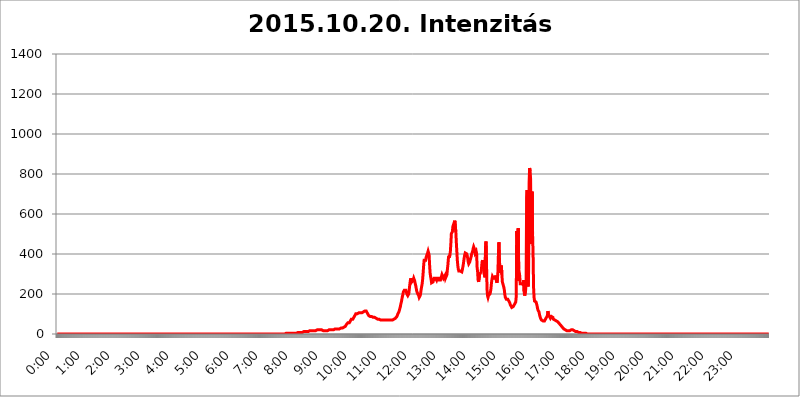
| Category | 2015.10.20. Intenzitás [W/m^2] |
|---|---|
| 0.0 | 0 |
| 0.0006944444444444445 | 0 |
| 0.001388888888888889 | 0 |
| 0.0020833333333333333 | 0 |
| 0.002777777777777778 | 0 |
| 0.003472222222222222 | 0 |
| 0.004166666666666667 | 0 |
| 0.004861111111111111 | 0 |
| 0.005555555555555556 | 0 |
| 0.0062499999999999995 | 0 |
| 0.006944444444444444 | 0 |
| 0.007638888888888889 | 0 |
| 0.008333333333333333 | 0 |
| 0.009027777777777779 | 0 |
| 0.009722222222222222 | 0 |
| 0.010416666666666666 | 0 |
| 0.011111111111111112 | 0 |
| 0.011805555555555555 | 0 |
| 0.012499999999999999 | 0 |
| 0.013194444444444444 | 0 |
| 0.013888888888888888 | 0 |
| 0.014583333333333332 | 0 |
| 0.015277777777777777 | 0 |
| 0.015972222222222224 | 0 |
| 0.016666666666666666 | 0 |
| 0.017361111111111112 | 0 |
| 0.018055555555555557 | 0 |
| 0.01875 | 0 |
| 0.019444444444444445 | 0 |
| 0.02013888888888889 | 0 |
| 0.020833333333333332 | 0 |
| 0.02152777777777778 | 0 |
| 0.022222222222222223 | 0 |
| 0.02291666666666667 | 0 |
| 0.02361111111111111 | 0 |
| 0.024305555555555556 | 0 |
| 0.024999999999999998 | 0 |
| 0.025694444444444447 | 0 |
| 0.02638888888888889 | 0 |
| 0.027083333333333334 | 0 |
| 0.027777777777777776 | 0 |
| 0.02847222222222222 | 0 |
| 0.029166666666666664 | 0 |
| 0.029861111111111113 | 0 |
| 0.030555555555555555 | 0 |
| 0.03125 | 0 |
| 0.03194444444444445 | 0 |
| 0.03263888888888889 | 0 |
| 0.03333333333333333 | 0 |
| 0.034027777777777775 | 0 |
| 0.034722222222222224 | 0 |
| 0.035416666666666666 | 0 |
| 0.036111111111111115 | 0 |
| 0.03680555555555556 | 0 |
| 0.0375 | 0 |
| 0.03819444444444444 | 0 |
| 0.03888888888888889 | 0 |
| 0.03958333333333333 | 0 |
| 0.04027777777777778 | 0 |
| 0.04097222222222222 | 0 |
| 0.041666666666666664 | 0 |
| 0.042361111111111106 | 0 |
| 0.04305555555555556 | 0 |
| 0.043750000000000004 | 0 |
| 0.044444444444444446 | 0 |
| 0.04513888888888889 | 0 |
| 0.04583333333333334 | 0 |
| 0.04652777777777778 | 0 |
| 0.04722222222222222 | 0 |
| 0.04791666666666666 | 0 |
| 0.04861111111111111 | 0 |
| 0.049305555555555554 | 0 |
| 0.049999999999999996 | 0 |
| 0.05069444444444445 | 0 |
| 0.051388888888888894 | 0 |
| 0.052083333333333336 | 0 |
| 0.05277777777777778 | 0 |
| 0.05347222222222222 | 0 |
| 0.05416666666666667 | 0 |
| 0.05486111111111111 | 0 |
| 0.05555555555555555 | 0 |
| 0.05625 | 0 |
| 0.05694444444444444 | 0 |
| 0.057638888888888885 | 0 |
| 0.05833333333333333 | 0 |
| 0.05902777777777778 | 0 |
| 0.059722222222222225 | 0 |
| 0.06041666666666667 | 0 |
| 0.061111111111111116 | 0 |
| 0.06180555555555556 | 0 |
| 0.0625 | 0 |
| 0.06319444444444444 | 0 |
| 0.06388888888888888 | 0 |
| 0.06458333333333334 | 0 |
| 0.06527777777777778 | 0 |
| 0.06597222222222222 | 0 |
| 0.06666666666666667 | 0 |
| 0.06736111111111111 | 0 |
| 0.06805555555555555 | 0 |
| 0.06874999999999999 | 0 |
| 0.06944444444444443 | 0 |
| 0.07013888888888889 | 0 |
| 0.07083333333333333 | 0 |
| 0.07152777777777779 | 0 |
| 0.07222222222222223 | 0 |
| 0.07291666666666667 | 0 |
| 0.07361111111111111 | 0 |
| 0.07430555555555556 | 0 |
| 0.075 | 0 |
| 0.07569444444444444 | 0 |
| 0.0763888888888889 | 0 |
| 0.07708333333333334 | 0 |
| 0.07777777777777778 | 0 |
| 0.07847222222222222 | 0 |
| 0.07916666666666666 | 0 |
| 0.0798611111111111 | 0 |
| 0.08055555555555556 | 0 |
| 0.08125 | 0 |
| 0.08194444444444444 | 0 |
| 0.08263888888888889 | 0 |
| 0.08333333333333333 | 0 |
| 0.08402777777777777 | 0 |
| 0.08472222222222221 | 0 |
| 0.08541666666666665 | 0 |
| 0.08611111111111112 | 0 |
| 0.08680555555555557 | 0 |
| 0.08750000000000001 | 0 |
| 0.08819444444444445 | 0 |
| 0.08888888888888889 | 0 |
| 0.08958333333333333 | 0 |
| 0.09027777777777778 | 0 |
| 0.09097222222222222 | 0 |
| 0.09166666666666667 | 0 |
| 0.09236111111111112 | 0 |
| 0.09305555555555556 | 0 |
| 0.09375 | 0 |
| 0.09444444444444444 | 0 |
| 0.09513888888888888 | 0 |
| 0.09583333333333333 | 0 |
| 0.09652777777777777 | 0 |
| 0.09722222222222222 | 0 |
| 0.09791666666666667 | 0 |
| 0.09861111111111111 | 0 |
| 0.09930555555555555 | 0 |
| 0.09999999999999999 | 0 |
| 0.10069444444444443 | 0 |
| 0.1013888888888889 | 0 |
| 0.10208333333333335 | 0 |
| 0.10277777777777779 | 0 |
| 0.10347222222222223 | 0 |
| 0.10416666666666667 | 0 |
| 0.10486111111111111 | 0 |
| 0.10555555555555556 | 0 |
| 0.10625 | 0 |
| 0.10694444444444444 | 0 |
| 0.1076388888888889 | 0 |
| 0.10833333333333334 | 0 |
| 0.10902777777777778 | 0 |
| 0.10972222222222222 | 0 |
| 0.1111111111111111 | 0 |
| 0.11180555555555556 | 0 |
| 0.11180555555555556 | 0 |
| 0.1125 | 0 |
| 0.11319444444444444 | 0 |
| 0.11388888888888889 | 0 |
| 0.11458333333333333 | 0 |
| 0.11527777777777777 | 0 |
| 0.11597222222222221 | 0 |
| 0.11666666666666665 | 0 |
| 0.1173611111111111 | 0 |
| 0.11805555555555557 | 0 |
| 0.11944444444444445 | 0 |
| 0.12013888888888889 | 0 |
| 0.12083333333333333 | 0 |
| 0.12152777777777778 | 0 |
| 0.12222222222222223 | 0 |
| 0.12291666666666667 | 0 |
| 0.12291666666666667 | 0 |
| 0.12361111111111112 | 0 |
| 0.12430555555555556 | 0 |
| 0.125 | 0 |
| 0.12569444444444444 | 0 |
| 0.12638888888888888 | 0 |
| 0.12708333333333333 | 0 |
| 0.16875 | 0 |
| 0.12847222222222224 | 0 |
| 0.12916666666666668 | 0 |
| 0.12986111111111112 | 0 |
| 0.13055555555555556 | 0 |
| 0.13125 | 0 |
| 0.13194444444444445 | 0 |
| 0.1326388888888889 | 0 |
| 0.13333333333333333 | 0 |
| 0.13402777777777777 | 0 |
| 0.13402777777777777 | 0 |
| 0.13472222222222222 | 0 |
| 0.13541666666666666 | 0 |
| 0.1361111111111111 | 0 |
| 0.13749999999999998 | 0 |
| 0.13819444444444443 | 0 |
| 0.1388888888888889 | 0 |
| 0.13958333333333334 | 0 |
| 0.14027777777777778 | 0 |
| 0.14097222222222222 | 0 |
| 0.14166666666666666 | 0 |
| 0.1423611111111111 | 0 |
| 0.14305555555555557 | 0 |
| 0.14375000000000002 | 0 |
| 0.14444444444444446 | 0 |
| 0.1451388888888889 | 0 |
| 0.1451388888888889 | 0 |
| 0.14652777777777778 | 0 |
| 0.14722222222222223 | 0 |
| 0.14791666666666667 | 0 |
| 0.1486111111111111 | 0 |
| 0.14930555555555555 | 0 |
| 0.15 | 0 |
| 0.15069444444444444 | 0 |
| 0.15138888888888888 | 0 |
| 0.15208333333333332 | 0 |
| 0.15277777777777776 | 0 |
| 0.15347222222222223 | 0 |
| 0.15416666666666667 | 0 |
| 0.15486111111111112 | 0 |
| 0.15555555555555556 | 0 |
| 0.15625 | 0 |
| 0.15694444444444444 | 0 |
| 0.15763888888888888 | 0 |
| 0.15833333333333333 | 0 |
| 0.15902777777777777 | 0 |
| 0.15972222222222224 | 0 |
| 0.16041666666666668 | 0 |
| 0.16111111111111112 | 0 |
| 0.16180555555555556 | 0 |
| 0.1625 | 0 |
| 0.16319444444444445 | 0 |
| 0.1638888888888889 | 0 |
| 0.16458333333333333 | 0 |
| 0.16527777777777777 | 0 |
| 0.16597222222222222 | 0 |
| 0.16666666666666666 | 0 |
| 0.1673611111111111 | 0 |
| 0.16805555555555554 | 0 |
| 0.16874999999999998 | 0 |
| 0.16944444444444443 | 0 |
| 0.17013888888888887 | 0 |
| 0.1708333333333333 | 0 |
| 0.17152777777777775 | 0 |
| 0.17222222222222225 | 0 |
| 0.1729166666666667 | 0 |
| 0.17361111111111113 | 0 |
| 0.17430555555555557 | 0 |
| 0.17500000000000002 | 0 |
| 0.17569444444444446 | 0 |
| 0.1763888888888889 | 0 |
| 0.17708333333333334 | 0 |
| 0.17777777777777778 | 0 |
| 0.17847222222222223 | 0 |
| 0.17916666666666667 | 0 |
| 0.1798611111111111 | 0 |
| 0.18055555555555555 | 0 |
| 0.18125 | 0 |
| 0.18194444444444444 | 0 |
| 0.1826388888888889 | 0 |
| 0.18333333333333335 | 0 |
| 0.1840277777777778 | 0 |
| 0.18472222222222223 | 0 |
| 0.18541666666666667 | 0 |
| 0.18611111111111112 | 0 |
| 0.18680555555555556 | 0 |
| 0.1875 | 0 |
| 0.18819444444444444 | 0 |
| 0.18888888888888888 | 0 |
| 0.18958333333333333 | 0 |
| 0.19027777777777777 | 0 |
| 0.1909722222222222 | 0 |
| 0.19166666666666665 | 0 |
| 0.19236111111111112 | 0 |
| 0.19305555555555554 | 0 |
| 0.19375 | 0 |
| 0.19444444444444445 | 0 |
| 0.1951388888888889 | 0 |
| 0.19583333333333333 | 0 |
| 0.19652777777777777 | 0 |
| 0.19722222222222222 | 0 |
| 0.19791666666666666 | 0 |
| 0.1986111111111111 | 0 |
| 0.19930555555555554 | 0 |
| 0.19999999999999998 | 0 |
| 0.20069444444444443 | 0 |
| 0.20138888888888887 | 0 |
| 0.2020833333333333 | 0 |
| 0.2027777777777778 | 0 |
| 0.2034722222222222 | 0 |
| 0.2041666666666667 | 0 |
| 0.20486111111111113 | 0 |
| 0.20555555555555557 | 0 |
| 0.20625000000000002 | 0 |
| 0.20694444444444446 | 0 |
| 0.2076388888888889 | 0 |
| 0.20833333333333334 | 0 |
| 0.20902777777777778 | 0 |
| 0.20972222222222223 | 0 |
| 0.21041666666666667 | 0 |
| 0.2111111111111111 | 0 |
| 0.21180555555555555 | 0 |
| 0.2125 | 0 |
| 0.21319444444444444 | 0 |
| 0.2138888888888889 | 0 |
| 0.21458333333333335 | 0 |
| 0.2152777777777778 | 0 |
| 0.21597222222222223 | 0 |
| 0.21666666666666667 | 0 |
| 0.21736111111111112 | 0 |
| 0.21805555555555556 | 0 |
| 0.21875 | 0 |
| 0.21944444444444444 | 0 |
| 0.22013888888888888 | 0 |
| 0.22083333333333333 | 0 |
| 0.22152777777777777 | 0 |
| 0.2222222222222222 | 0 |
| 0.22291666666666665 | 0 |
| 0.2236111111111111 | 0 |
| 0.22430555555555556 | 0 |
| 0.225 | 0 |
| 0.22569444444444445 | 0 |
| 0.2263888888888889 | 0 |
| 0.22708333333333333 | 0 |
| 0.22777777777777777 | 0 |
| 0.22847222222222222 | 0 |
| 0.22916666666666666 | 0 |
| 0.2298611111111111 | 0 |
| 0.23055555555555554 | 0 |
| 0.23124999999999998 | 0 |
| 0.23194444444444443 | 0 |
| 0.23263888888888887 | 0 |
| 0.2333333333333333 | 0 |
| 0.2340277777777778 | 0 |
| 0.2347222222222222 | 0 |
| 0.2354166666666667 | 0 |
| 0.23611111111111113 | 0 |
| 0.23680555555555557 | 0 |
| 0.23750000000000002 | 0 |
| 0.23819444444444446 | 0 |
| 0.2388888888888889 | 0 |
| 0.23958333333333334 | 0 |
| 0.24027777777777778 | 0 |
| 0.24097222222222223 | 0 |
| 0.24166666666666667 | 0 |
| 0.2423611111111111 | 0 |
| 0.24305555555555555 | 0 |
| 0.24375 | 0 |
| 0.24444444444444446 | 0 |
| 0.24513888888888888 | 0 |
| 0.24583333333333335 | 0 |
| 0.2465277777777778 | 0 |
| 0.24722222222222223 | 0 |
| 0.24791666666666667 | 0 |
| 0.24861111111111112 | 0 |
| 0.24930555555555556 | 0 |
| 0.25 | 0 |
| 0.25069444444444444 | 0 |
| 0.2513888888888889 | 0 |
| 0.2520833333333333 | 0 |
| 0.25277777777777777 | 0 |
| 0.2534722222222222 | 0 |
| 0.25416666666666665 | 0 |
| 0.2548611111111111 | 0 |
| 0.2555555555555556 | 0 |
| 0.25625000000000003 | 0 |
| 0.2569444444444445 | 0 |
| 0.2576388888888889 | 0 |
| 0.25833333333333336 | 0 |
| 0.2590277777777778 | 0 |
| 0.25972222222222224 | 0 |
| 0.2604166666666667 | 0 |
| 0.2611111111111111 | 0 |
| 0.26180555555555557 | 0 |
| 0.2625 | 0 |
| 0.26319444444444445 | 0 |
| 0.2638888888888889 | 0 |
| 0.26458333333333334 | 0 |
| 0.2652777777777778 | 0 |
| 0.2659722222222222 | 0 |
| 0.26666666666666666 | 0 |
| 0.2673611111111111 | 0 |
| 0.26805555555555555 | 0 |
| 0.26875 | 0 |
| 0.26944444444444443 | 0 |
| 0.2701388888888889 | 0 |
| 0.2708333333333333 | 0 |
| 0.27152777777777776 | 0 |
| 0.2722222222222222 | 0 |
| 0.27291666666666664 | 0 |
| 0.2736111111111111 | 0 |
| 0.2743055555555555 | 0 |
| 0.27499999999999997 | 0 |
| 0.27569444444444446 | 0 |
| 0.27638888888888885 | 0 |
| 0.27708333333333335 | 0 |
| 0.2777777777777778 | 0 |
| 0.27847222222222223 | 0 |
| 0.2791666666666667 | 0 |
| 0.2798611111111111 | 0 |
| 0.28055555555555556 | 0 |
| 0.28125 | 0 |
| 0.28194444444444444 | 0 |
| 0.2826388888888889 | 0 |
| 0.2833333333333333 | 0 |
| 0.28402777777777777 | 0 |
| 0.2847222222222222 | 0 |
| 0.28541666666666665 | 0 |
| 0.28611111111111115 | 0 |
| 0.28680555555555554 | 0 |
| 0.28750000000000003 | 0 |
| 0.2881944444444445 | 0 |
| 0.2888888888888889 | 0 |
| 0.28958333333333336 | 0 |
| 0.2902777777777778 | 0 |
| 0.29097222222222224 | 0 |
| 0.2916666666666667 | 0 |
| 0.2923611111111111 | 0 |
| 0.29305555555555557 | 0 |
| 0.29375 | 0 |
| 0.29444444444444445 | 0 |
| 0.2951388888888889 | 0 |
| 0.29583333333333334 | 0 |
| 0.2965277777777778 | 0 |
| 0.2972222222222222 | 0 |
| 0.29791666666666666 | 0 |
| 0.2986111111111111 | 0 |
| 0.29930555555555555 | 0 |
| 0.3 | 0 |
| 0.30069444444444443 | 0 |
| 0.3013888888888889 | 0 |
| 0.3020833333333333 | 0 |
| 0.30277777777777776 | 0 |
| 0.3034722222222222 | 0 |
| 0.30416666666666664 | 0 |
| 0.3048611111111111 | 0 |
| 0.3055555555555555 | 0 |
| 0.30624999999999997 | 0 |
| 0.3069444444444444 | 0 |
| 0.3076388888888889 | 0 |
| 0.30833333333333335 | 0 |
| 0.3090277777777778 | 0 |
| 0.30972222222222223 | 0 |
| 0.3104166666666667 | 0 |
| 0.3111111111111111 | 0 |
| 0.31180555555555556 | 0 |
| 0.3125 | 0 |
| 0.31319444444444444 | 0 |
| 0.3138888888888889 | 0 |
| 0.3145833333333333 | 0 |
| 0.31527777777777777 | 0 |
| 0.3159722222222222 | 0 |
| 0.31666666666666665 | 0 |
| 0.31736111111111115 | 0 |
| 0.31805555555555554 | 0 |
| 0.31875000000000003 | 0 |
| 0.3194444444444445 | 0 |
| 0.3201388888888889 | 0 |
| 0.32083333333333336 | 3.525 |
| 0.3215277777777778 | 3.525 |
| 0.32222222222222224 | 3.525 |
| 0.3229166666666667 | 3.525 |
| 0.3236111111111111 | 3.525 |
| 0.32430555555555557 | 3.525 |
| 0.325 | 3.525 |
| 0.32569444444444445 | 3.525 |
| 0.3263888888888889 | 3.525 |
| 0.32708333333333334 | 3.525 |
| 0.3277777777777778 | 3.525 |
| 0.3284722222222222 | 3.525 |
| 0.32916666666666666 | 3.525 |
| 0.3298611111111111 | 3.525 |
| 0.33055555555555555 | 3.525 |
| 0.33125 | 3.525 |
| 0.33194444444444443 | 3.525 |
| 0.3326388888888889 | 3.525 |
| 0.3333333333333333 | 3.525 |
| 0.3340277777777778 | 3.525 |
| 0.3347222222222222 | 7.887 |
| 0.3354166666666667 | 3.525 |
| 0.3361111111111111 | 3.525 |
| 0.3368055555555556 | 3.525 |
| 0.33749999999999997 | 7.887 |
| 0.33819444444444446 | 7.887 |
| 0.33888888888888885 | 7.887 |
| 0.33958333333333335 | 7.887 |
| 0.34027777777777773 | 7.887 |
| 0.34097222222222223 | 7.887 |
| 0.3416666666666666 | 7.887 |
| 0.3423611111111111 | 7.887 |
| 0.3430555555555555 | 7.887 |
| 0.34375 | 7.887 |
| 0.3444444444444445 | 7.887 |
| 0.3451388888888889 | 7.887 |
| 0.3458333333333334 | 12.257 |
| 0.34652777777777777 | 12.257 |
| 0.34722222222222227 | 12.257 |
| 0.34791666666666665 | 12.257 |
| 0.34861111111111115 | 12.257 |
| 0.34930555555555554 | 12.257 |
| 0.35000000000000003 | 12.257 |
| 0.3506944444444444 | 12.257 |
| 0.3513888888888889 | 12.257 |
| 0.3520833333333333 | 12.257 |
| 0.3527777777777778 | 12.257 |
| 0.3534722222222222 | 16.636 |
| 0.3541666666666667 | 16.636 |
| 0.3548611111111111 | 16.636 |
| 0.35555555555555557 | 16.636 |
| 0.35625 | 16.636 |
| 0.35694444444444445 | 16.636 |
| 0.3576388888888889 | 16.636 |
| 0.35833333333333334 | 16.636 |
| 0.3590277777777778 | 16.636 |
| 0.3597222222222222 | 16.636 |
| 0.36041666666666666 | 16.636 |
| 0.3611111111111111 | 16.636 |
| 0.36180555555555555 | 16.636 |
| 0.3625 | 16.636 |
| 0.36319444444444443 | 21.024 |
| 0.3638888888888889 | 21.024 |
| 0.3645833333333333 | 21.024 |
| 0.3652777777777778 | 21.024 |
| 0.3659722222222222 | 21.024 |
| 0.3666666666666667 | 21.024 |
| 0.3673611111111111 | 21.024 |
| 0.3680555555555556 | 21.024 |
| 0.36874999999999997 | 21.024 |
| 0.36944444444444446 | 21.024 |
| 0.37013888888888885 | 21.024 |
| 0.37083333333333335 | 21.024 |
| 0.37152777777777773 | 16.636 |
| 0.37222222222222223 | 16.636 |
| 0.3729166666666666 | 16.636 |
| 0.3736111111111111 | 21.024 |
| 0.3743055555555555 | 21.024 |
| 0.375 | 16.636 |
| 0.3756944444444445 | 16.636 |
| 0.3763888888888889 | 16.636 |
| 0.3770833333333334 | 16.636 |
| 0.37777777777777777 | 16.636 |
| 0.37847222222222227 | 21.024 |
| 0.37916666666666665 | 16.636 |
| 0.37986111111111115 | 16.636 |
| 0.38055555555555554 | 21.024 |
| 0.38125000000000003 | 21.024 |
| 0.3819444444444444 | 21.024 |
| 0.3826388888888889 | 21.024 |
| 0.3833333333333333 | 21.024 |
| 0.3840277777777778 | 21.024 |
| 0.3847222222222222 | 21.024 |
| 0.3854166666666667 | 21.024 |
| 0.3861111111111111 | 21.024 |
| 0.38680555555555557 | 21.024 |
| 0.3875 | 21.024 |
| 0.38819444444444445 | 25.419 |
| 0.3888888888888889 | 25.419 |
| 0.38958333333333334 | 25.419 |
| 0.3902777777777778 | 21.024 |
| 0.3909722222222222 | 21.024 |
| 0.39166666666666666 | 25.419 |
| 0.3923611111111111 | 25.419 |
| 0.39305555555555555 | 25.419 |
| 0.39375 | 25.419 |
| 0.39444444444444443 | 25.419 |
| 0.3951388888888889 | 25.419 |
| 0.3958333333333333 | 25.419 |
| 0.3965277777777778 | 25.419 |
| 0.3972222222222222 | 29.823 |
| 0.3979166666666667 | 29.823 |
| 0.3986111111111111 | 29.823 |
| 0.3993055555555556 | 29.823 |
| 0.39999999999999997 | 29.823 |
| 0.40069444444444446 | 29.823 |
| 0.40138888888888885 | 34.234 |
| 0.40208333333333335 | 34.234 |
| 0.40277777777777773 | 34.234 |
| 0.40347222222222223 | 38.653 |
| 0.4041666666666666 | 38.653 |
| 0.4048611111111111 | 43.079 |
| 0.4055555555555555 | 47.511 |
| 0.40625 | 47.511 |
| 0.4069444444444445 | 51.951 |
| 0.4076388888888889 | 56.398 |
| 0.4083333333333334 | 56.398 |
| 0.40902777777777777 | 56.398 |
| 0.40972222222222227 | 56.398 |
| 0.41041666666666665 | 60.85 |
| 0.41111111111111115 | 65.31 |
| 0.41180555555555554 | 69.775 |
| 0.41250000000000003 | 74.246 |
| 0.4131944444444444 | 74.246 |
| 0.4138888888888889 | 78.722 |
| 0.4145833333333333 | 74.246 |
| 0.4152777777777778 | 78.722 |
| 0.4159722222222222 | 83.205 |
| 0.4166666666666667 | 87.692 |
| 0.4173611111111111 | 92.184 |
| 0.41805555555555557 | 96.682 |
| 0.41875 | 101.184 |
| 0.41944444444444445 | 101.184 |
| 0.4201388888888889 | 105.69 |
| 0.42083333333333334 | 101.184 |
| 0.4215277777777778 | 105.69 |
| 0.4222222222222222 | 105.69 |
| 0.42291666666666666 | 105.69 |
| 0.4236111111111111 | 110.201 |
| 0.42430555555555555 | 110.201 |
| 0.425 | 105.69 |
| 0.42569444444444443 | 105.69 |
| 0.4263888888888889 | 105.69 |
| 0.4270833333333333 | 105.69 |
| 0.4277777777777778 | 105.69 |
| 0.4284722222222222 | 105.69 |
| 0.4291666666666667 | 110.201 |
| 0.4298611111111111 | 110.201 |
| 0.4305555555555556 | 114.716 |
| 0.43124999999999997 | 114.716 |
| 0.43194444444444446 | 119.235 |
| 0.43263888888888885 | 114.716 |
| 0.43333333333333335 | 114.716 |
| 0.43402777777777773 | 110.201 |
| 0.43472222222222223 | 105.69 |
| 0.4354166666666666 | 101.184 |
| 0.4361111111111111 | 101.184 |
| 0.4368055555555555 | 92.184 |
| 0.4375 | 92.184 |
| 0.4381944444444445 | 87.692 |
| 0.4388888888888889 | 87.692 |
| 0.4395833333333334 | 87.692 |
| 0.44027777777777777 | 87.692 |
| 0.44097222222222227 | 87.692 |
| 0.44166666666666665 | 87.692 |
| 0.44236111111111115 | 87.692 |
| 0.44305555555555554 | 83.205 |
| 0.44375000000000003 | 83.205 |
| 0.4444444444444444 | 87.692 |
| 0.4451388888888889 | 83.205 |
| 0.4458333333333333 | 83.205 |
| 0.4465277777777778 | 78.722 |
| 0.4472222222222222 | 78.722 |
| 0.4479166666666667 | 74.246 |
| 0.4486111111111111 | 74.246 |
| 0.44930555555555557 | 74.246 |
| 0.45 | 74.246 |
| 0.45069444444444445 | 74.246 |
| 0.4513888888888889 | 74.246 |
| 0.45208333333333334 | 74.246 |
| 0.4527777777777778 | 74.246 |
| 0.4534722222222222 | 69.775 |
| 0.45416666666666666 | 74.246 |
| 0.4548611111111111 | 69.775 |
| 0.45555555555555555 | 69.775 |
| 0.45625 | 69.775 |
| 0.45694444444444443 | 69.775 |
| 0.4576388888888889 | 69.775 |
| 0.4583333333333333 | 69.775 |
| 0.4590277777777778 | 69.775 |
| 0.4597222222222222 | 69.775 |
| 0.4604166666666667 | 69.775 |
| 0.4611111111111111 | 69.775 |
| 0.4618055555555556 | 69.775 |
| 0.46249999999999997 | 69.775 |
| 0.46319444444444446 | 69.775 |
| 0.46388888888888885 | 69.775 |
| 0.46458333333333335 | 69.775 |
| 0.46527777777777773 | 69.775 |
| 0.46597222222222223 | 69.775 |
| 0.4666666666666666 | 69.775 |
| 0.4673611111111111 | 69.775 |
| 0.4680555555555555 | 69.775 |
| 0.46875 | 69.775 |
| 0.4694444444444445 | 69.775 |
| 0.4701388888888889 | 69.775 |
| 0.4708333333333334 | 74.246 |
| 0.47152777777777777 | 74.246 |
| 0.47222222222222227 | 74.246 |
| 0.47291666666666665 | 74.246 |
| 0.47361111111111115 | 74.246 |
| 0.47430555555555554 | 78.722 |
| 0.47500000000000003 | 83.205 |
| 0.4756944444444444 | 83.205 |
| 0.4763888888888889 | 87.692 |
| 0.4770833333333333 | 92.184 |
| 0.4777777777777778 | 101.184 |
| 0.4784722222222222 | 105.69 |
| 0.4791666666666667 | 110.201 |
| 0.4798611111111111 | 119.235 |
| 0.48055555555555557 | 128.284 |
| 0.48125 | 137.347 |
| 0.48194444444444445 | 150.964 |
| 0.4826388888888889 | 160.056 |
| 0.48333333333333334 | 173.709 |
| 0.4840277777777778 | 187.378 |
| 0.4847222222222222 | 196.497 |
| 0.48541666666666666 | 210.182 |
| 0.4861111111111111 | 214.746 |
| 0.48680555555555555 | 219.309 |
| 0.4875 | 219.309 |
| 0.48819444444444443 | 219.309 |
| 0.4888888888888889 | 219.309 |
| 0.4895833333333333 | 210.182 |
| 0.4902777777777778 | 201.058 |
| 0.4909722222222222 | 196.497 |
| 0.4916666666666667 | 191.937 |
| 0.4923611111111111 | 191.937 |
| 0.4930555555555556 | 201.058 |
| 0.49374999999999997 | 223.873 |
| 0.49444444444444446 | 246.689 |
| 0.49513888888888885 | 264.932 |
| 0.49583333333333335 | 278.603 |
| 0.49652777777777773 | 274.047 |
| 0.49722222222222223 | 260.373 |
| 0.4979166666666666 | 255.813 |
| 0.4986111111111111 | 260.373 |
| 0.4993055555555555 | 269.49 |
| 0.5 | 278.603 |
| 0.5006944444444444 | 274.047 |
| 0.5013888888888889 | 264.932 |
| 0.5020833333333333 | 251.251 |
| 0.5027777777777778 | 242.127 |
| 0.5034722222222222 | 228.436 |
| 0.5041666666666667 | 214.746 |
| 0.5048611111111111 | 210.182 |
| 0.5055555555555555 | 201.058 |
| 0.50625 | 196.497 |
| 0.5069444444444444 | 191.937 |
| 0.5076388888888889 | 182.82 |
| 0.5083333333333333 | 182.82 |
| 0.5090277777777777 | 191.937 |
| 0.5097222222222222 | 205.62 |
| 0.5104166666666666 | 223.873 |
| 0.5111111111111112 | 237.564 |
| 0.5118055555555555 | 251.251 |
| 0.5125000000000001 | 274.047 |
| 0.5131944444444444 | 305.898 |
| 0.513888888888889 | 342.162 |
| 0.5145833333333333 | 369.23 |
| 0.5152777777777778 | 373.729 |
| 0.5159722222222222 | 369.23 |
| 0.5166666666666667 | 369.23 |
| 0.517361111111111 | 382.715 |
| 0.5180555555555556 | 391.685 |
| 0.5187499999999999 | 396.164 |
| 0.5194444444444445 | 405.108 |
| 0.5201388888888888 | 414.035 |
| 0.5208333333333334 | 414.035 |
| 0.5215277777777778 | 396.164 |
| 0.5222222222222223 | 346.682 |
| 0.5229166666666667 | 305.898 |
| 0.5236111111111111 | 287.709 |
| 0.5243055555555556 | 274.047 |
| 0.525 | 255.813 |
| 0.5256944444444445 | 251.251 |
| 0.5263888888888889 | 255.813 |
| 0.5270833333333333 | 260.373 |
| 0.5277777777777778 | 269.49 |
| 0.5284722222222222 | 278.603 |
| 0.5291666666666667 | 278.603 |
| 0.5298611111111111 | 278.603 |
| 0.5305555555555556 | 278.603 |
| 0.53125 | 274.047 |
| 0.5319444444444444 | 269.49 |
| 0.5326388888888889 | 278.603 |
| 0.5333333333333333 | 283.156 |
| 0.5340277777777778 | 283.156 |
| 0.5347222222222222 | 278.603 |
| 0.5354166666666667 | 269.49 |
| 0.5361111111111111 | 264.932 |
| 0.5368055555555555 | 269.49 |
| 0.5375 | 269.49 |
| 0.5381944444444444 | 278.603 |
| 0.5388888888888889 | 283.156 |
| 0.5395833333333333 | 296.808 |
| 0.5402777777777777 | 301.354 |
| 0.5409722222222222 | 292.259 |
| 0.5416666666666666 | 278.603 |
| 0.5423611111111112 | 278.603 |
| 0.5430555555555555 | 283.156 |
| 0.5437500000000001 | 292.259 |
| 0.5444444444444444 | 278.603 |
| 0.545138888888889 | 274.047 |
| 0.5458333333333333 | 278.603 |
| 0.5465277777777778 | 296.808 |
| 0.5472222222222222 | 324.052 |
| 0.5479166666666667 | 346.682 |
| 0.548611111111111 | 378.224 |
| 0.5493055555555556 | 391.685 |
| 0.5499999999999999 | 382.715 |
| 0.5506944444444445 | 396.164 |
| 0.5513888888888888 | 414.035 |
| 0.5520833333333334 | 453.968 |
| 0.5527777777777778 | 502.192 |
| 0.5534722222222223 | 497.836 |
| 0.5541666666666667 | 510.885 |
| 0.5548611111111111 | 536.82 |
| 0.5555555555555556 | 545.416 |
| 0.55625 | 545.416 |
| 0.5569444444444445 | 545.416 |
| 0.5576388888888889 | 566.793 |
| 0.5583333333333333 | 566.793 |
| 0.5590277777777778 | 510.885 |
| 0.5597222222222222 | 458.38 |
| 0.5604166666666667 | 414.035 |
| 0.5611111111111111 | 369.23 |
| 0.5618055555555556 | 342.162 |
| 0.5625 | 324.052 |
| 0.5631944444444444 | 314.98 |
| 0.5638888888888889 | 314.98 |
| 0.5645833333333333 | 319.517 |
| 0.5652777777777778 | 314.98 |
| 0.5659722222222222 | 310.44 |
| 0.5666666666666667 | 310.44 |
| 0.5673611111111111 | 310.44 |
| 0.5680555555555555 | 319.517 |
| 0.56875 | 333.113 |
| 0.5694444444444444 | 346.682 |
| 0.5701388888888889 | 364.728 |
| 0.5708333333333333 | 382.715 |
| 0.5715277777777777 | 396.164 |
| 0.5722222222222222 | 405.108 |
| 0.5729166666666666 | 405.108 |
| 0.5736111111111112 | 405.108 |
| 0.5743055555555555 | 400.638 |
| 0.5750000000000001 | 391.685 |
| 0.5756944444444444 | 378.224 |
| 0.576388888888889 | 360.221 |
| 0.5770833333333333 | 351.198 |
| 0.5777777777777778 | 351.198 |
| 0.5784722222222222 | 360.221 |
| 0.5791666666666667 | 360.221 |
| 0.579861111111111 | 378.224 |
| 0.5805555555555556 | 387.202 |
| 0.5812499999999999 | 400.638 |
| 0.5819444444444445 | 405.108 |
| 0.5826388888888888 | 414.035 |
| 0.5833333333333334 | 427.39 |
| 0.5840277777777778 | 436.27 |
| 0.5847222222222223 | 431.833 |
| 0.5854166666666667 | 422.943 |
| 0.5861111111111111 | 405.108 |
| 0.5868055555555556 | 400.638 |
| 0.5875 | 414.035 |
| 0.5881944444444445 | 400.638 |
| 0.5888888888888889 | 333.113 |
| 0.5895833333333333 | 310.44 |
| 0.5902777777777778 | 269.49 |
| 0.5909722222222222 | 260.373 |
| 0.5916666666666667 | 264.932 |
| 0.5923611111111111 | 296.808 |
| 0.5930555555555556 | 296.808 |
| 0.59375 | 296.808 |
| 0.5944444444444444 | 310.44 |
| 0.5951388888888889 | 333.113 |
| 0.5958333333333333 | 360.221 |
| 0.5965277777777778 | 369.23 |
| 0.5972222222222222 | 355.712 |
| 0.5979166666666667 | 337.639 |
| 0.5986111111111111 | 301.354 |
| 0.5993055555555555 | 296.808 |
| 0.6 | 283.156 |
| 0.6006944444444444 | 436.27 |
| 0.6013888888888889 | 462.786 |
| 0.6020833333333333 | 346.682 |
| 0.6027777777777777 | 223.873 |
| 0.6034722222222222 | 191.937 |
| 0.6041666666666666 | 182.82 |
| 0.6048611111111112 | 191.937 |
| 0.6055555555555555 | 196.497 |
| 0.6062500000000001 | 196.497 |
| 0.6069444444444444 | 201.058 |
| 0.607638888888889 | 210.182 |
| 0.6083333333333333 | 228.436 |
| 0.6090277777777778 | 255.813 |
| 0.6097222222222222 | 274.047 |
| 0.6104166666666667 | 287.709 |
| 0.611111111111111 | 283.156 |
| 0.6118055555555556 | 278.603 |
| 0.6124999999999999 | 278.603 |
| 0.6131944444444445 | 274.047 |
| 0.6138888888888888 | 278.603 |
| 0.6145833333333334 | 292.259 |
| 0.6152777777777778 | 278.603 |
| 0.6159722222222223 | 264.932 |
| 0.6166666666666667 | 255.813 |
| 0.6173611111111111 | 274.047 |
| 0.6180555555555556 | 310.44 |
| 0.61875 | 396.164 |
| 0.6194444444444445 | 458.38 |
| 0.6201388888888889 | 373.729 |
| 0.6208333333333333 | 328.584 |
| 0.6215277777777778 | 305.898 |
| 0.6222222222222222 | 305.898 |
| 0.6229166666666667 | 342.162 |
| 0.6236111111111111 | 296.808 |
| 0.6243055555555556 | 260.373 |
| 0.625 | 251.251 |
| 0.6256944444444444 | 242.127 |
| 0.6263888888888889 | 233 |
| 0.6270833333333333 | 219.309 |
| 0.6277777777777778 | 196.497 |
| 0.6284722222222222 | 182.82 |
| 0.6291666666666667 | 178.264 |
| 0.6298611111111111 | 173.709 |
| 0.6305555555555555 | 173.709 |
| 0.63125 | 173.709 |
| 0.6319444444444444 | 173.709 |
| 0.6326388888888889 | 173.709 |
| 0.6333333333333333 | 164.605 |
| 0.6340277777777777 | 160.056 |
| 0.6347222222222222 | 155.509 |
| 0.6354166666666666 | 146.423 |
| 0.6361111111111112 | 146.423 |
| 0.6368055555555555 | 141.884 |
| 0.6375000000000001 | 132.814 |
| 0.6381944444444444 | 128.284 |
| 0.638888888888889 | 132.814 |
| 0.6395833333333333 | 137.347 |
| 0.6402777777777778 | 137.347 |
| 0.6409722222222222 | 146.423 |
| 0.6416666666666667 | 146.423 |
| 0.642361111111111 | 150.964 |
| 0.6430555555555556 | 160.056 |
| 0.6437499999999999 | 187.378 |
| 0.6444444444444445 | 515.223 |
| 0.6451388888888888 | 418.492 |
| 0.6458333333333334 | 264.932 |
| 0.6465277777777778 | 528.2 |
| 0.6472222222222223 | 324.052 |
| 0.6479166666666667 | 324.052 |
| 0.6486111111111111 | 292.259 |
| 0.6493055555555556 | 251.251 |
| 0.65 | 251.251 |
| 0.6506944444444445 | 255.813 |
| 0.6513888888888889 | 251.251 |
| 0.6520833333333333 | 251.251 |
| 0.6527777777777778 | 246.689 |
| 0.6534722222222222 | 246.689 |
| 0.6541666666666667 | 269.49 |
| 0.6548611111111111 | 210.182 |
| 0.6555555555555556 | 191.937 |
| 0.65625 | 191.937 |
| 0.6569444444444444 | 219.309 |
| 0.6576388888888889 | 269.49 |
| 0.6583333333333333 | 683.473 |
| 0.6590277777777778 | 719.877 |
| 0.6597222222222222 | 387.202 |
| 0.6604166666666667 | 237.564 |
| 0.6611111111111111 | 314.98 |
| 0.6618055555555555 | 755.766 |
| 0.6625 | 829.981 |
| 0.6631944444444444 | 814.519 |
| 0.6638888888888889 | 775.492 |
| 0.6645833333333333 | 462.786 |
| 0.6652777777777777 | 449.551 |
| 0.6659722222222222 | 711.832 |
| 0.6666666666666666 | 497.836 |
| 0.6673611111111111 | 400.638 |
| 0.6680555555555556 | 233 |
| 0.6687500000000001 | 182.82 |
| 0.6694444444444444 | 164.605 |
| 0.6701388888888888 | 164.605 |
| 0.6708333333333334 | 164.605 |
| 0.6715277777777778 | 160.056 |
| 0.6722222222222222 | 150.964 |
| 0.6729166666666666 | 141.884 |
| 0.6736111111111112 | 128.284 |
| 0.6743055555555556 | 119.235 |
| 0.6749999999999999 | 114.716 |
| 0.6756944444444444 | 110.201 |
| 0.6763888888888889 | 96.682 |
| 0.6770833333333334 | 87.692 |
| 0.6777777777777777 | 78.722 |
| 0.6784722222222223 | 74.246 |
| 0.6791666666666667 | 69.775 |
| 0.6798611111111111 | 65.31 |
| 0.6805555555555555 | 65.31 |
| 0.68125 | 65.31 |
| 0.6819444444444445 | 65.31 |
| 0.6826388888888889 | 65.31 |
| 0.6833333333333332 | 65.31 |
| 0.6840277777777778 | 69.775 |
| 0.6847222222222222 | 74.246 |
| 0.6854166666666667 | 78.722 |
| 0.686111111111111 | 83.205 |
| 0.6868055555555556 | 83.205 |
| 0.6875 | 92.184 |
| 0.6881944444444444 | 114.716 |
| 0.688888888888889 | 96.682 |
| 0.6895833333333333 | 96.682 |
| 0.6902777777777778 | 87.692 |
| 0.6909722222222222 | 83.205 |
| 0.6916666666666668 | 78.722 |
| 0.6923611111111111 | 78.722 |
| 0.6930555555555555 | 87.692 |
| 0.69375 | 87.692 |
| 0.6944444444444445 | 87.692 |
| 0.6951388888888889 | 83.205 |
| 0.6958333333333333 | 74.246 |
| 0.6965277777777777 | 74.246 |
| 0.6972222222222223 | 69.775 |
| 0.6979166666666666 | 69.775 |
| 0.6986111111111111 | 69.775 |
| 0.6993055555555556 | 69.775 |
| 0.7000000000000001 | 65.31 |
| 0.7006944444444444 | 65.31 |
| 0.7013888888888888 | 65.31 |
| 0.7020833333333334 | 60.85 |
| 0.7027777777777778 | 60.85 |
| 0.7034722222222222 | 56.398 |
| 0.7041666666666666 | 51.951 |
| 0.7048611111111112 | 47.511 |
| 0.7055555555555556 | 47.511 |
| 0.7062499999999999 | 43.079 |
| 0.7069444444444444 | 38.653 |
| 0.7076388888888889 | 38.653 |
| 0.7083333333333334 | 34.234 |
| 0.7090277777777777 | 29.823 |
| 0.7097222222222223 | 29.823 |
| 0.7104166666666667 | 25.419 |
| 0.7111111111111111 | 21.024 |
| 0.7118055555555555 | 21.024 |
| 0.7125 | 21.024 |
| 0.7131944444444445 | 21.024 |
| 0.7138888888888889 | 16.636 |
| 0.7145833333333332 | 16.636 |
| 0.7152777777777778 | 16.636 |
| 0.7159722222222222 | 16.636 |
| 0.7166666666666667 | 16.636 |
| 0.717361111111111 | 16.636 |
| 0.7180555555555556 | 16.636 |
| 0.71875 | 16.636 |
| 0.7194444444444444 | 16.636 |
| 0.720138888888889 | 21.024 |
| 0.7208333333333333 | 21.024 |
| 0.7215277777777778 | 21.024 |
| 0.7222222222222222 | 21.024 |
| 0.7229166666666668 | 21.024 |
| 0.7236111111111111 | 16.636 |
| 0.7243055555555555 | 16.636 |
| 0.725 | 16.636 |
| 0.7256944444444445 | 16.636 |
| 0.7263888888888889 | 16.636 |
| 0.7270833333333333 | 12.257 |
| 0.7277777777777777 | 12.257 |
| 0.7284722222222223 | 12.257 |
| 0.7291666666666666 | 12.257 |
| 0.7298611111111111 | 7.887 |
| 0.7305555555555556 | 7.887 |
| 0.7312500000000001 | 7.887 |
| 0.7319444444444444 | 3.525 |
| 0.7326388888888888 | 7.887 |
| 0.7333333333333334 | 7.887 |
| 0.7340277777777778 | 3.525 |
| 0.7347222222222222 | 3.525 |
| 0.7354166666666666 | 3.525 |
| 0.7361111111111112 | 3.525 |
| 0.7368055555555556 | 3.525 |
| 0.7374999999999999 | 3.525 |
| 0.7381944444444444 | 3.525 |
| 0.7388888888888889 | 3.525 |
| 0.7395833333333334 | 3.525 |
| 0.7402777777777777 | 3.525 |
| 0.7409722222222223 | 3.525 |
| 0.7416666666666667 | 3.525 |
| 0.7423611111111111 | 0 |
| 0.7430555555555555 | 0 |
| 0.74375 | 0 |
| 0.7444444444444445 | 0 |
| 0.7451388888888889 | 0 |
| 0.7458333333333332 | 0 |
| 0.7465277777777778 | 0 |
| 0.7472222222222222 | 0 |
| 0.7479166666666667 | 0 |
| 0.748611111111111 | 0 |
| 0.7493055555555556 | 0 |
| 0.75 | 0 |
| 0.7506944444444444 | 0 |
| 0.751388888888889 | 0 |
| 0.7520833333333333 | 0 |
| 0.7527777777777778 | 0 |
| 0.7534722222222222 | 0 |
| 0.7541666666666668 | 0 |
| 0.7548611111111111 | 0 |
| 0.7555555555555555 | 0 |
| 0.75625 | 0 |
| 0.7569444444444445 | 0 |
| 0.7576388888888889 | 0 |
| 0.7583333333333333 | 0 |
| 0.7590277777777777 | 0 |
| 0.7597222222222223 | 0 |
| 0.7604166666666666 | 0 |
| 0.7611111111111111 | 0 |
| 0.7618055555555556 | 0 |
| 0.7625000000000001 | 0 |
| 0.7631944444444444 | 0 |
| 0.7638888888888888 | 0 |
| 0.7645833333333334 | 0 |
| 0.7652777777777778 | 0 |
| 0.7659722222222222 | 0 |
| 0.7666666666666666 | 0 |
| 0.7673611111111112 | 0 |
| 0.7680555555555556 | 0 |
| 0.7687499999999999 | 0 |
| 0.7694444444444444 | 0 |
| 0.7701388888888889 | 0 |
| 0.7708333333333334 | 0 |
| 0.7715277777777777 | 0 |
| 0.7722222222222223 | 0 |
| 0.7729166666666667 | 0 |
| 0.7736111111111111 | 0 |
| 0.7743055555555555 | 0 |
| 0.775 | 0 |
| 0.7756944444444445 | 0 |
| 0.7763888888888889 | 0 |
| 0.7770833333333332 | 0 |
| 0.7777777777777778 | 0 |
| 0.7784722222222222 | 0 |
| 0.7791666666666667 | 0 |
| 0.779861111111111 | 0 |
| 0.7805555555555556 | 0 |
| 0.78125 | 0 |
| 0.7819444444444444 | 0 |
| 0.782638888888889 | 0 |
| 0.7833333333333333 | 0 |
| 0.7840277777777778 | 0 |
| 0.7847222222222222 | 0 |
| 0.7854166666666668 | 0 |
| 0.7861111111111111 | 0 |
| 0.7868055555555555 | 0 |
| 0.7875 | 0 |
| 0.7881944444444445 | 0 |
| 0.7888888888888889 | 0 |
| 0.7895833333333333 | 0 |
| 0.7902777777777777 | 0 |
| 0.7909722222222223 | 0 |
| 0.7916666666666666 | 0 |
| 0.7923611111111111 | 0 |
| 0.7930555555555556 | 0 |
| 0.7937500000000001 | 0 |
| 0.7944444444444444 | 0 |
| 0.7951388888888888 | 0 |
| 0.7958333333333334 | 0 |
| 0.7965277777777778 | 0 |
| 0.7972222222222222 | 0 |
| 0.7979166666666666 | 0 |
| 0.7986111111111112 | 0 |
| 0.7993055555555556 | 0 |
| 0.7999999999999999 | 0 |
| 0.8006944444444444 | 0 |
| 0.8013888888888889 | 0 |
| 0.8020833333333334 | 0 |
| 0.8027777777777777 | 0 |
| 0.8034722222222223 | 0 |
| 0.8041666666666667 | 0 |
| 0.8048611111111111 | 0 |
| 0.8055555555555555 | 0 |
| 0.80625 | 0 |
| 0.8069444444444445 | 0 |
| 0.8076388888888889 | 0 |
| 0.8083333333333332 | 0 |
| 0.8090277777777778 | 0 |
| 0.8097222222222222 | 0 |
| 0.8104166666666667 | 0 |
| 0.811111111111111 | 0 |
| 0.8118055555555556 | 0 |
| 0.8125 | 0 |
| 0.8131944444444444 | 0 |
| 0.813888888888889 | 0 |
| 0.8145833333333333 | 0 |
| 0.8152777777777778 | 0 |
| 0.8159722222222222 | 0 |
| 0.8166666666666668 | 0 |
| 0.8173611111111111 | 0 |
| 0.8180555555555555 | 0 |
| 0.81875 | 0 |
| 0.8194444444444445 | 0 |
| 0.8201388888888889 | 0 |
| 0.8208333333333333 | 0 |
| 0.8215277777777777 | 0 |
| 0.8222222222222223 | 0 |
| 0.8229166666666666 | 0 |
| 0.8236111111111111 | 0 |
| 0.8243055555555556 | 0 |
| 0.8250000000000001 | 0 |
| 0.8256944444444444 | 0 |
| 0.8263888888888888 | 0 |
| 0.8270833333333334 | 0 |
| 0.8277777777777778 | 0 |
| 0.8284722222222222 | 0 |
| 0.8291666666666666 | 0 |
| 0.8298611111111112 | 0 |
| 0.8305555555555556 | 0 |
| 0.8312499999999999 | 0 |
| 0.8319444444444444 | 0 |
| 0.8326388888888889 | 0 |
| 0.8333333333333334 | 0 |
| 0.8340277777777777 | 0 |
| 0.8347222222222223 | 0 |
| 0.8354166666666667 | 0 |
| 0.8361111111111111 | 0 |
| 0.8368055555555555 | 0 |
| 0.8375 | 0 |
| 0.8381944444444445 | 0 |
| 0.8388888888888889 | 0 |
| 0.8395833333333332 | 0 |
| 0.8402777777777778 | 0 |
| 0.8409722222222222 | 0 |
| 0.8416666666666667 | 0 |
| 0.842361111111111 | 0 |
| 0.8430555555555556 | 0 |
| 0.84375 | 0 |
| 0.8444444444444444 | 0 |
| 0.845138888888889 | 0 |
| 0.8458333333333333 | 0 |
| 0.8465277777777778 | 0 |
| 0.8472222222222222 | 0 |
| 0.8479166666666668 | 0 |
| 0.8486111111111111 | 0 |
| 0.8493055555555555 | 0 |
| 0.85 | 0 |
| 0.8506944444444445 | 0 |
| 0.8513888888888889 | 0 |
| 0.8520833333333333 | 0 |
| 0.8527777777777777 | 0 |
| 0.8534722222222223 | 0 |
| 0.8541666666666666 | 0 |
| 0.8548611111111111 | 0 |
| 0.8555555555555556 | 0 |
| 0.8562500000000001 | 0 |
| 0.8569444444444444 | 0 |
| 0.8576388888888888 | 0 |
| 0.8583333333333334 | 0 |
| 0.8590277777777778 | 0 |
| 0.8597222222222222 | 0 |
| 0.8604166666666666 | 0 |
| 0.8611111111111112 | 0 |
| 0.8618055555555556 | 0 |
| 0.8624999999999999 | 0 |
| 0.8631944444444444 | 0 |
| 0.8638888888888889 | 0 |
| 0.8645833333333334 | 0 |
| 0.8652777777777777 | 0 |
| 0.8659722222222223 | 0 |
| 0.8666666666666667 | 0 |
| 0.8673611111111111 | 0 |
| 0.8680555555555555 | 0 |
| 0.86875 | 0 |
| 0.8694444444444445 | 0 |
| 0.8701388888888889 | 0 |
| 0.8708333333333332 | 0 |
| 0.8715277777777778 | 0 |
| 0.8722222222222222 | 0 |
| 0.8729166666666667 | 0 |
| 0.873611111111111 | 0 |
| 0.8743055555555556 | 0 |
| 0.875 | 0 |
| 0.8756944444444444 | 0 |
| 0.876388888888889 | 0 |
| 0.8770833333333333 | 0 |
| 0.8777777777777778 | 0 |
| 0.8784722222222222 | 0 |
| 0.8791666666666668 | 0 |
| 0.8798611111111111 | 0 |
| 0.8805555555555555 | 0 |
| 0.88125 | 0 |
| 0.8819444444444445 | 0 |
| 0.8826388888888889 | 0 |
| 0.8833333333333333 | 0 |
| 0.8840277777777777 | 0 |
| 0.8847222222222223 | 0 |
| 0.8854166666666666 | 0 |
| 0.8861111111111111 | 0 |
| 0.8868055555555556 | 0 |
| 0.8875000000000001 | 0 |
| 0.8881944444444444 | 0 |
| 0.8888888888888888 | 0 |
| 0.8895833333333334 | 0 |
| 0.8902777777777778 | 0 |
| 0.8909722222222222 | 0 |
| 0.8916666666666666 | 0 |
| 0.8923611111111112 | 0 |
| 0.8930555555555556 | 0 |
| 0.8937499999999999 | 0 |
| 0.8944444444444444 | 0 |
| 0.8951388888888889 | 0 |
| 0.8958333333333334 | 0 |
| 0.8965277777777777 | 0 |
| 0.8972222222222223 | 0 |
| 0.8979166666666667 | 0 |
| 0.8986111111111111 | 0 |
| 0.8993055555555555 | 0 |
| 0.9 | 0 |
| 0.9006944444444445 | 0 |
| 0.9013888888888889 | 0 |
| 0.9020833333333332 | 0 |
| 0.9027777777777778 | 0 |
| 0.9034722222222222 | 0 |
| 0.9041666666666667 | 0 |
| 0.904861111111111 | 0 |
| 0.9055555555555556 | 0 |
| 0.90625 | 0 |
| 0.9069444444444444 | 0 |
| 0.907638888888889 | 0 |
| 0.9083333333333333 | 0 |
| 0.9090277777777778 | 0 |
| 0.9097222222222222 | 0 |
| 0.9104166666666668 | 0 |
| 0.9111111111111111 | 0 |
| 0.9118055555555555 | 0 |
| 0.9125 | 0 |
| 0.9131944444444445 | 0 |
| 0.9138888888888889 | 0 |
| 0.9145833333333333 | 0 |
| 0.9152777777777777 | 0 |
| 0.9159722222222223 | 0 |
| 0.9166666666666666 | 0 |
| 0.9173611111111111 | 0 |
| 0.9180555555555556 | 0 |
| 0.9187500000000001 | 0 |
| 0.9194444444444444 | 0 |
| 0.9201388888888888 | 0 |
| 0.9208333333333334 | 0 |
| 0.9215277777777778 | 0 |
| 0.9222222222222222 | 0 |
| 0.9229166666666666 | 0 |
| 0.9236111111111112 | 0 |
| 0.9243055555555556 | 0 |
| 0.9249999999999999 | 0 |
| 0.9256944444444444 | 0 |
| 0.9263888888888889 | 0 |
| 0.9270833333333334 | 0 |
| 0.9277777777777777 | 0 |
| 0.9284722222222223 | 0 |
| 0.9291666666666667 | 0 |
| 0.9298611111111111 | 0 |
| 0.9305555555555555 | 0 |
| 0.93125 | 0 |
| 0.9319444444444445 | 0 |
| 0.9326388888888889 | 0 |
| 0.9333333333333332 | 0 |
| 0.9340277777777778 | 0 |
| 0.9347222222222222 | 0 |
| 0.9354166666666667 | 0 |
| 0.936111111111111 | 0 |
| 0.9368055555555556 | 0 |
| 0.9375 | 0 |
| 0.9381944444444444 | 0 |
| 0.938888888888889 | 0 |
| 0.9395833333333333 | 0 |
| 0.9402777777777778 | 0 |
| 0.9409722222222222 | 0 |
| 0.9416666666666668 | 0 |
| 0.9423611111111111 | 0 |
| 0.9430555555555555 | 0 |
| 0.94375 | 0 |
| 0.9444444444444445 | 0 |
| 0.9451388888888889 | 0 |
| 0.9458333333333333 | 0 |
| 0.9465277777777777 | 0 |
| 0.9472222222222223 | 0 |
| 0.9479166666666666 | 0 |
| 0.9486111111111111 | 0 |
| 0.9493055555555556 | 0 |
| 0.9500000000000001 | 0 |
| 0.9506944444444444 | 0 |
| 0.9513888888888888 | 0 |
| 0.9520833333333334 | 0 |
| 0.9527777777777778 | 0 |
| 0.9534722222222222 | 0 |
| 0.9541666666666666 | 0 |
| 0.9548611111111112 | 0 |
| 0.9555555555555556 | 0 |
| 0.9562499999999999 | 0 |
| 0.9569444444444444 | 0 |
| 0.9576388888888889 | 0 |
| 0.9583333333333334 | 0 |
| 0.9590277777777777 | 0 |
| 0.9597222222222223 | 0 |
| 0.9604166666666667 | 0 |
| 0.9611111111111111 | 0 |
| 0.9618055555555555 | 0 |
| 0.9625 | 0 |
| 0.9631944444444445 | 0 |
| 0.9638888888888889 | 0 |
| 0.9645833333333332 | 0 |
| 0.9652777777777778 | 0 |
| 0.9659722222222222 | 0 |
| 0.9666666666666667 | 0 |
| 0.967361111111111 | 0 |
| 0.9680555555555556 | 0 |
| 0.96875 | 0 |
| 0.9694444444444444 | 0 |
| 0.970138888888889 | 0 |
| 0.9708333333333333 | 0 |
| 0.9715277777777778 | 0 |
| 0.9722222222222222 | 0 |
| 0.9729166666666668 | 0 |
| 0.9736111111111111 | 0 |
| 0.9743055555555555 | 0 |
| 0.975 | 0 |
| 0.9756944444444445 | 0 |
| 0.9763888888888889 | 0 |
| 0.9770833333333333 | 0 |
| 0.9777777777777777 | 0 |
| 0.9784722222222223 | 0 |
| 0.9791666666666666 | 0 |
| 0.9798611111111111 | 0 |
| 0.9805555555555556 | 0 |
| 0.9812500000000001 | 0 |
| 0.9819444444444444 | 0 |
| 0.9826388888888888 | 0 |
| 0.9833333333333334 | 0 |
| 0.9840277777777778 | 0 |
| 0.9847222222222222 | 0 |
| 0.9854166666666666 | 0 |
| 0.9861111111111112 | 0 |
| 0.9868055555555556 | 0 |
| 0.9874999999999999 | 0 |
| 0.9881944444444444 | 0 |
| 0.9888888888888889 | 0 |
| 0.9895833333333334 | 0 |
| 0.9902777777777777 | 0 |
| 0.9909722222222223 | 0 |
| 0.9916666666666667 | 0 |
| 0.9923611111111111 | 0 |
| 0.9930555555555555 | 0 |
| 0.99375 | 0 |
| 0.9944444444444445 | 0 |
| 0.9951388888888889 | 0 |
| 0.9958333333333332 | 0 |
| 0.9965277777777778 | 0 |
| 0.9972222222222222 | 0 |
| 0.9979166666666667 | 0 |
| 0.998611111111111 | 0 |
| 0.9993055555555556 | 0 |